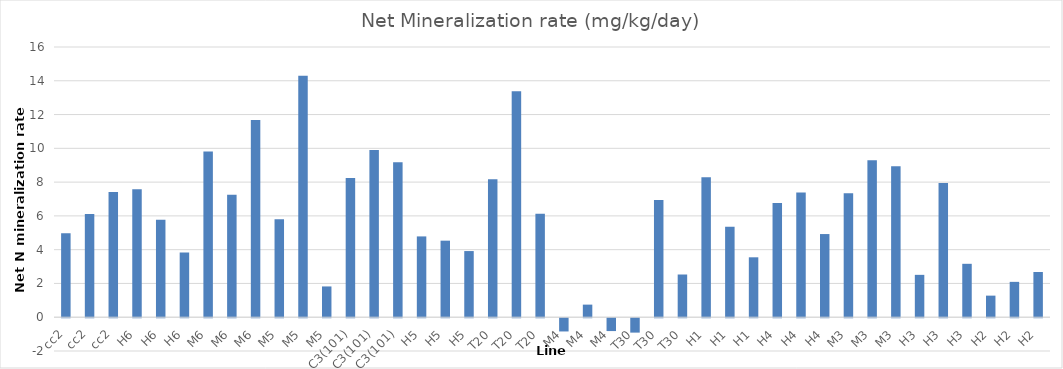
| Category | Net Mineralization rate (mg/kg/day) |
|---|---|
| cc2 | 4.978 |
| cc2 | 6.105 |
| cc2 | 7.409 |
| H6 | 7.573 |
| H6 | 5.77 |
| H6 | 3.832 |
| M6 | 9.811 |
| M6 | 7.254 |
| M6 | 11.681 |
| M5 | 5.808 |
| M5 | 14.304 |
| M5 | 1.823 |
| C3(101) | 8.243 |
| C3(101) | 9.9 |
| C3(101) | 9.172 |
| H5 | 4.785 |
| H5 | 4.533 |
| H5 | 3.917 |
| T20 | 8.163 |
| T20 | 13.383 |
| T20 | 6.125 |
| M4 | -0.784 |
| M4 | 0.746 |
| M4 | -0.761 |
| T30 | -0.852 |
| T30 | 6.935 |
| T30 | 2.529 |
| H1 | 8.282 |
| H1 | 5.35 |
| H1 | 3.548 |
| H4 | 6.767 |
| H4 | 7.385 |
| H4 | 4.925 |
| M3 | 7.343 |
| M3 | 9.298 |
| M3 | 8.945 |
| H3 | 2.509 |
| H3 | 7.951 |
| H3 | 3.163 |
| H2 | 1.278 |
| H2 | 2.094 |
| H2 | 2.678 |